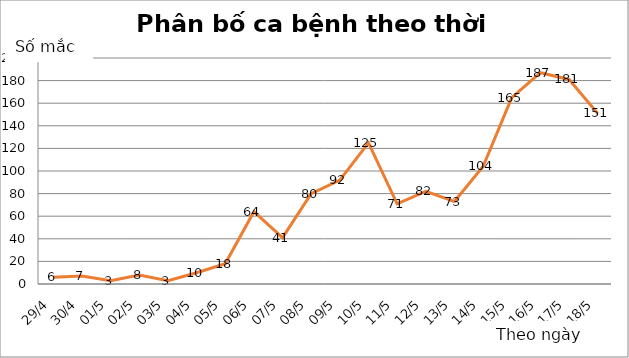
| Category | Series 0 |
|---|---|
| 29/4 | 6 |
| 30/4 | 7 |
| 01/5 | 3 |
| 02/5 | 8 |
| 03/5 | 3 |
| 04/5 | 10 |
| 05/5 | 18 |
| 06/5 | 64 |
| 07/5 | 41 |
| 08/5 | 80 |
| 09/5 | 92 |
| 10/5 | 125 |
| 11/5 | 71 |
| 12/5 | 82 |
| 13/5 | 73 |
| 14/5 | 104 |
| 15/5 | 165 |
| 16/5 | 187 |
| 17/5 | 181 |
| 18/5 | 151 |